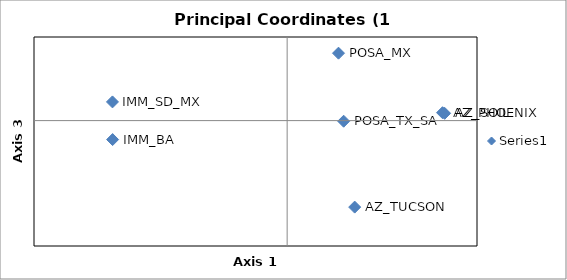
| Category | Series 0 |
|---|---|
| 0.4910764242808443 | 0.009 |
| 0.4977217309624026 | 0.009 |
| 0.21343055427367144 | -0.103 |
| -0.551552400910419 | -0.023 |
| -0.5520646854489263 | 0.022 |
| 0.16230704596056494 | 0.081 |
| 0.17862369301887757 | -0.001 |